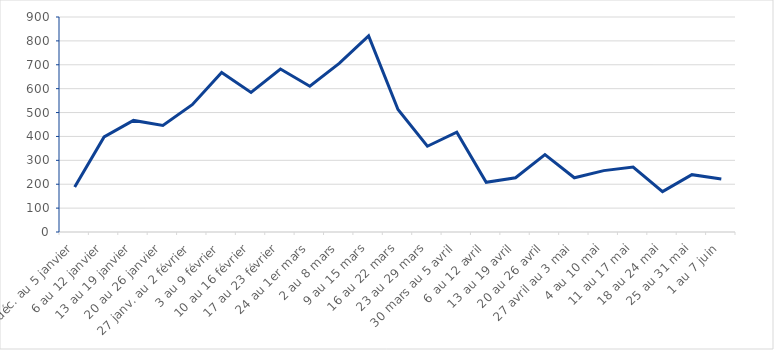
| Category | Series 0 |
|---|---|
| 30 déc. au 5 janvier | 188 |
| 6 au 12 janvier | 398 |
| 13 au 19 janvier | 467 |
| 20 au 26 janvier | 446 |
| 27 janv. au 2 février | 533 |
| 3 au 9 février | 668 |
| 10 au 16 février | 584 |
| 17 au 23 février | 682 |
| 24 au 1er mars | 610 |
| 2 au 8 mars | 706 |
| 9 au 15 mars | 821 |
| 16 au 22 mars | 513 |
| 23 au 29 mars | 359 |
| 30 mars au 5 avril | 418 |
| 6 au 12 avril | 208 |
| 13 au 19 avril | 227 |
| 20 au 26 avril | 324 |
| 27 avril au 3 mai | 227 |
| 4 au 10 mai | 257 |
| 11 au 17 mai | 272 |
| 18 au 24 mai | 169 |
| 25 au 31 mai | 240 |
| 1 au 7 juin | 222 |